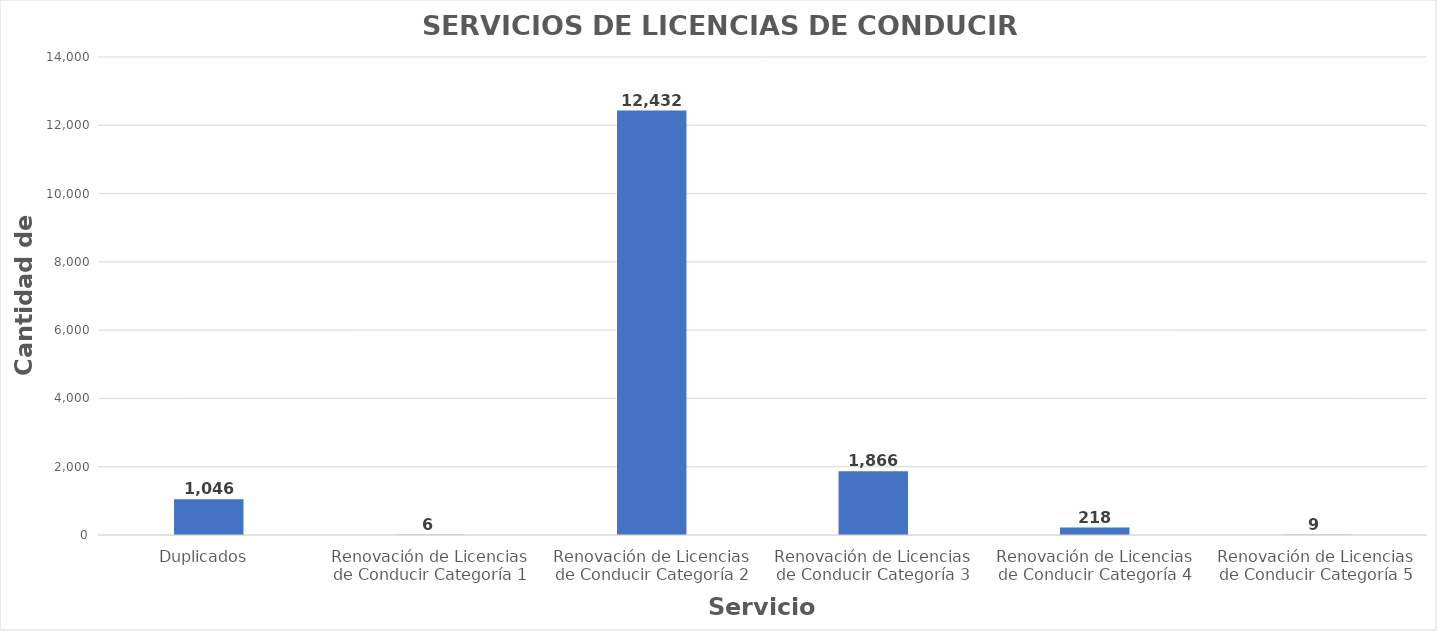
| Category | Series 0 |
|---|---|
| Duplicados  | 1046 |
| Renovación de Licencias de Conducir Categoría 1 | 6 |
| Renovación de Licencias de Conducir Categoría 2 | 12432 |
| Renovación de Licencias de Conducir Categoría 3 | 1866 |
| Renovación de Licencias de Conducir Categoría 4 | 218 |
| Renovación de Licencias de Conducir Categoría 5 | 9 |